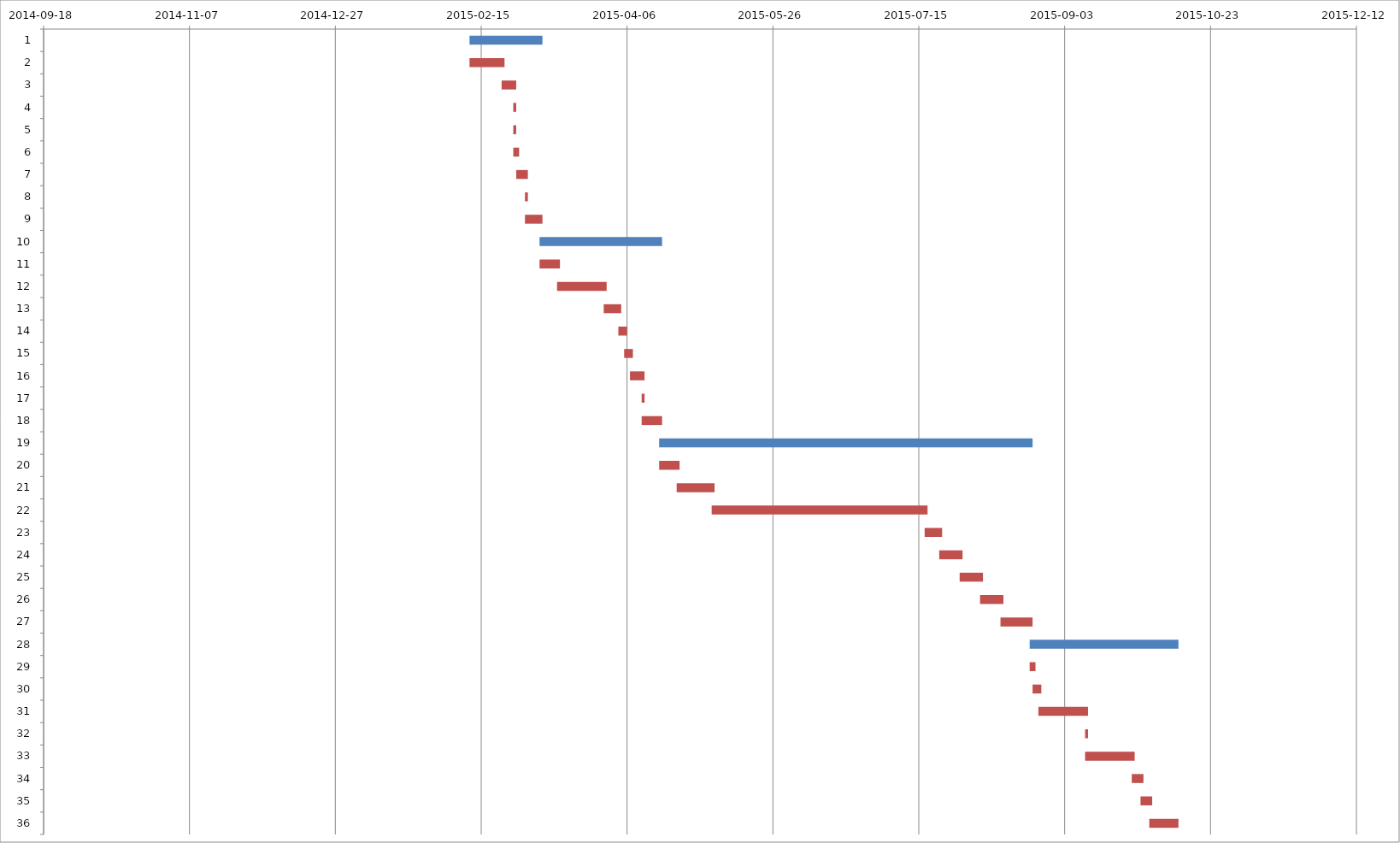
| Category | Series 0 | Series 1 |
|---|---|---|
| 0 | 2015-02-11 | 25 |
| 1 | 2015-02-11 | 12 |
| 2 | 2015-02-22 | 5 |
| 3 | 2015-02-26 | 1 |
| 4 | 2015-02-26 | 1 |
| 5 | 2015-02-26 | 2 |
| 6 | 2015-02-27 | 4 |
| 7 | 2015-03-02 | 1 |
| 8 | 2015-03-02 | 6 |
| 9 | 2015-03-07 | 42 |
| 10 | 2015-03-07 | 7 |
| 11 | 2015-03-13 | 17 |
| 12 | 2015-03-29 | 6 |
| 13 | 2015-04-03 | 3 |
| 14 | 2015-04-05 | 3 |
| 15 | 2015-04-07 | 5 |
| 16 | 2015-04-11 | 1 |
| 17 | 2015-04-11 | 7 |
| 18 | 2015-04-17 | 128 |
| 19 | 2015-04-17 | 7 |
| 20 | 2015-04-23 | 13 |
| 21 | 2015-05-05 | 74 |
| 22 | 2015-07-17 | 6 |
| 23 | 2015-07-22 | 8 |
| 24 | 2015-07-29 | 8 |
| 25 | 2015-08-05 | 8 |
| 26 | 2015-08-12 | 11 |
| 27 | 2015-08-22 | 51 |
| 28 | 2015-08-22 | 2 |
| 29 | 2015-08-23 | 3 |
| 30 | 2015-08-25 | 17 |
| 31 | 2015-09-10 | 1 |
| 32 | 2015-09-10 | 17 |
| 33 | 2015-09-26 | 4 |
| 34 | 2015-09-29 | 4 |
| 35 | 2015-10-02 | 10 |